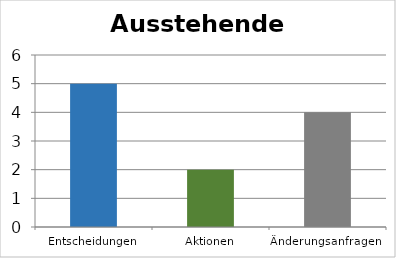
| Category | Series 0 |
|---|---|
| Entscheidungen | 5 |
| Aktionen | 2 |
| Änderungsanfragen  | 4 |